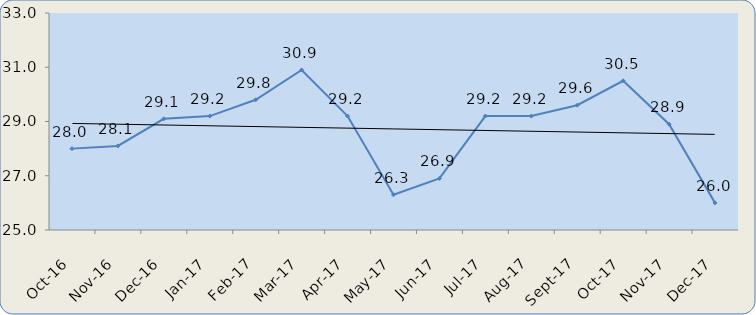
| Category | out/16 nov/16 dez/16 jan/17 fev/17 mar/17 abr/17 mai/17 jun/17 jul/17 ago/17 set/17 out/17 nov/17 dez/17 | out/16 nov/16 dez/16 jan/17 fev/17 mar/17 abr/17 mai/17 jun/17 jul/17 ago/17 set/17 out/17 nov/17 |
|---|---|---|
| 2016-10-01 | 28 |  |
| 2016-11-01 | 28.1 |  |
| 2016-12-01 | 29.1 |  |
| 2017-01-01 | 29.2 |  |
| 2017-02-01 | 29.8 |  |
| 2017-03-01 | 30.9 |  |
| 2017-04-01 | 29.2 |  |
| 2017-05-01 | 26.3 |  |
| 2017-06-01 | 26.9 |  |
| 2017-07-01 | 29.2 |  |
| 2017-08-01 | 29.2 |  |
| 2017-09-01 | 29.6 |  |
| 2017-10-01 | 30.5 |  |
| 2017-11-01 | 28.9 |  |
| 2017-12-01 | 26 |  |